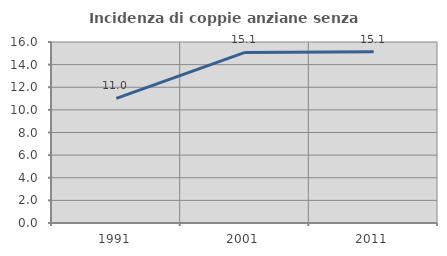
| Category | Incidenza di coppie anziane senza figli  |
|---|---|
| 1991.0 | 11.009 |
| 2001.0 | 15.075 |
| 2011.0 | 15.135 |